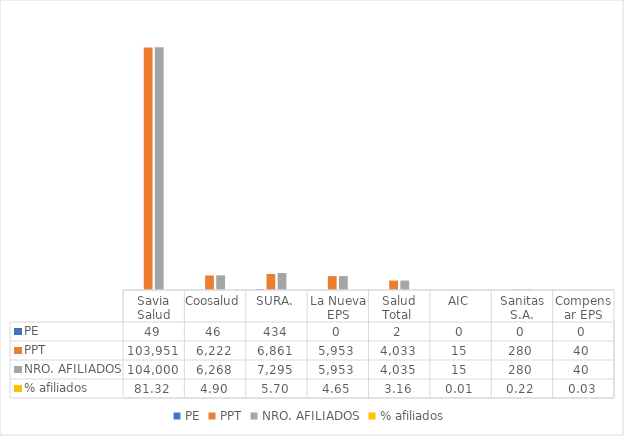
| Category | PE | PPT | NRO. AFILIADOS | % afiliados |
|---|---|---|---|---|
| Savia Salud | 49 | 103951 | 104000 | 81.322 |
| Coosalud | 46 | 6222 | 6268 | 4.901 |
| SURA. | 434 | 6861 | 7295 | 5.704 |
| La Nueva EPS | 0 | 5953 | 5953 | 4.655 |
| Salud Total  | 2 | 4033 | 4035 | 3.155 |
| AIC | 0 | 15 | 15 | 0.012 |
| Sanitas S.A. | 0 | 280 | 280 | 0.219 |
| Compensar EPS | 0 | 40 | 40 | 0.031 |